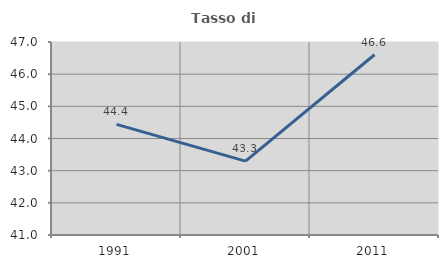
| Category | Tasso di occupazione   |
|---|---|
| 1991.0 | 44.438 |
| 2001.0 | 43.298 |
| 2011.0 | 46.604 |